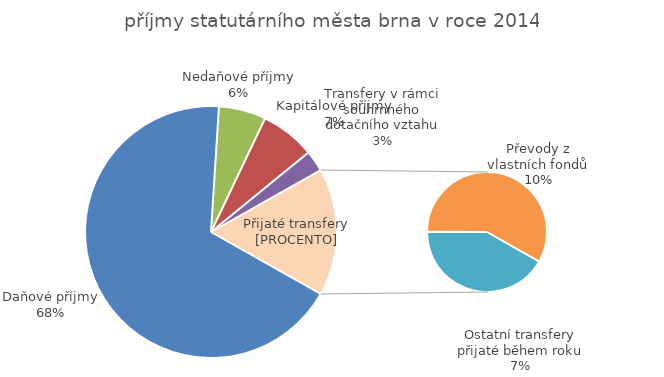
| Category | Series 0 |
|---|---|
| Daňové příjmy | 8218 |
| Nedaňové příjmy | 735 |
| Kapitálové příjmy | 852 |
| Transfery v rámci souhrnného dotačního vztahu | 328.403 |
| Ostatní transfery přijaté během roku | 830.097 |
| Převody z vlastních fondů | 1153.5 |